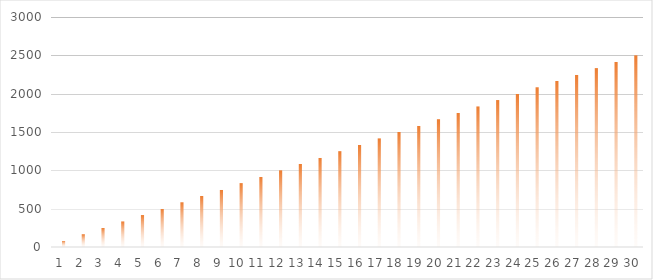
| Category | Minuten | Ziel |
|---|---|---|
| 0 | 0 | 83.333 |
| 1 | 0 | 166.667 |
| 2 | 0 | 250 |
| 3 | 0 | 333.333 |
| 4 | 0 | 416.667 |
| 5 | 0 | 500 |
| 6 | 0 | 583.333 |
| 7 | 0 | 666.667 |
| 8 | 0 | 750 |
| 9 | 0 | 833.333 |
| 10 | 0 | 916.667 |
| 11 | 0 | 1000 |
| 12 | 0 | 1083.333 |
| 13 | 0 | 1166.667 |
| 14 | 0 | 1250 |
| 15 | 0 | 1333.333 |
| 16 | 0 | 1416.667 |
| 17 | 0 | 1500 |
| 18 | 0 | 1583.333 |
| 19 | 0 | 1666.667 |
| 20 | 0 | 1750 |
| 21 | 0 | 1833.333 |
| 22 | 0 | 1916.667 |
| 23 | 0 | 2000 |
| 24 | 0 | 2083.333 |
| 25 | 0 | 2166.667 |
| 26 | 0 | 2250 |
| 27 | 0 | 2333.333 |
| 28 | 0 | 2416.667 |
| 29 | 0 | 2500 |